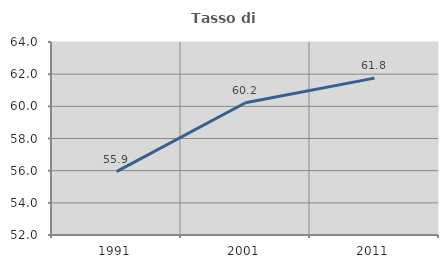
| Category | Tasso di occupazione   |
|---|---|
| 1991.0 | 55.943 |
| 2001.0 | 60.221 |
| 2011.0 | 61.753 |